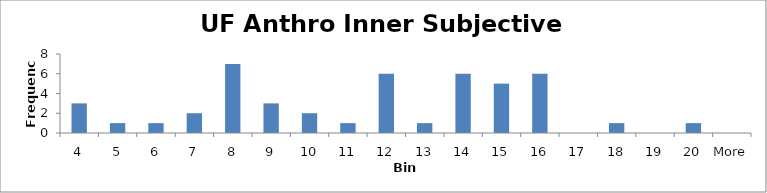
| Category | Frequency |
|---|---|
| 4 | 3 |
| 5 | 1 |
| 6 | 1 |
| 7 | 2 |
| 8 | 7 |
| 9 | 3 |
| 10 | 2 |
| 11 | 1 |
| 12 | 6 |
| 13 | 1 |
| 14 | 6 |
| 15 | 5 |
| 16 | 6 |
| 17 | 0 |
| 18 | 1 |
| 19 | 0 |
| 20 | 1 |
| More | 0 |